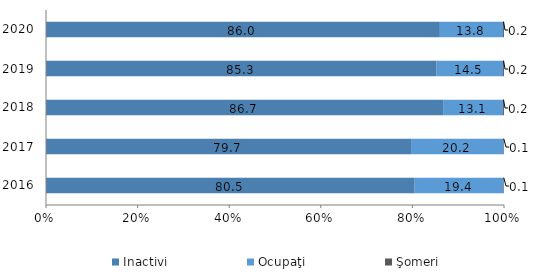
| Category | Inactivi | Ocupaţi | Şomeri |
|---|---|---|---|
| 2016.0 | 80.5 | 19.4 | 0.1 |
| 2017.0 | 79.7 | 20.2 | 0.1 |
| 2018.0 | 86.7 | 13.1 | 0.2 |
| 2019.0 | 85.3 | 14.5 | 0.2 |
| 2020.0 | 86 | 13.8 | 0.2 |